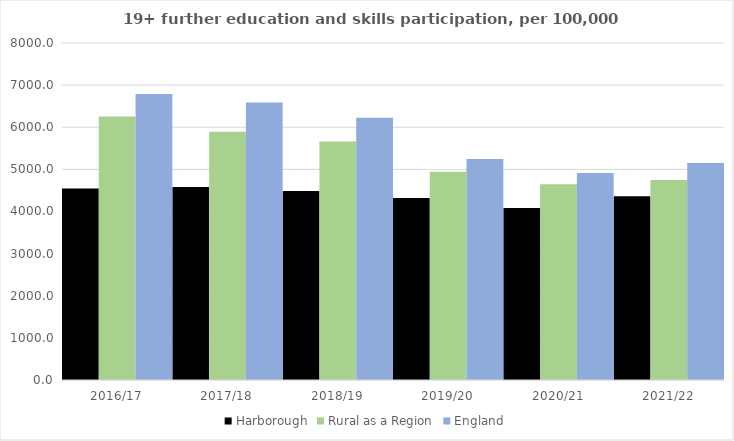
| Category | Harborough | Rural as a Region | England |
|---|---|---|---|
| 2016/17 | 4546 | 6253.401 | 6788 |
| 2017/18 | 4581 | 5892.029 | 6588 |
| 2018/19 | 4484 | 5661.873 | 6227 |
| 2019/20 | 4320 | 4943.801 | 5244 |
| 2020/21 | 4085 | 4646.727 | 4913 |
| 2021/22 | 4362 | 4747.049 | 5151 |